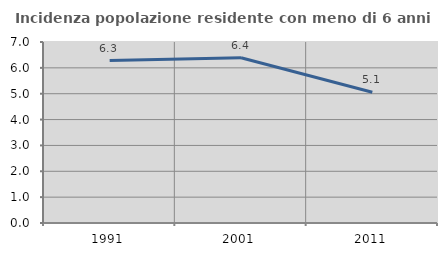
| Category | Incidenza popolazione residente con meno di 6 anni |
|---|---|
| 1991.0 | 6.281 |
| 2001.0 | 6.389 |
| 2011.0 | 5.059 |